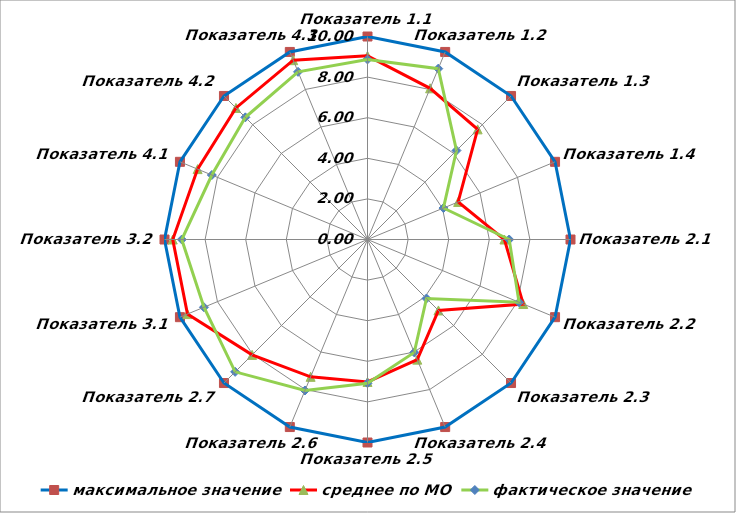
| Category | максимальное значение | среднее по МО | фактическое значение |
|---|---|---|---|
| Показатель 1.1 | 10 | 9.046 | 8.87 |
| Показатель 1.2 | 10 | 8.061 | 9.11 |
| Показатель 1.3 | 10 | 7.673 | 6.2 |
| Показатель 1.4 | 10 | 4.833 | 4.05 |
| Показатель 2.1 | 10 | 6.745 | 6.98 |
| Показатель 2.2 | 10 | 8.305 | 8.08 |
| Показатель 2.3 | 10 | 4.943 | 4.11 |
| Показатель 2.4 | 10 | 6.405 | 6.02 |
| Показатель 2.5 | 10 | 7.017 | 7.08 |
| Показатель 2.6 | 10 | 7.323 | 8.05 |
| Показатель 2.7 | 10 | 8.039 | 9.22 |
| Показатель 3.1 | 10 | 9.599 | 8.72 |
| Показатель 3.2 | 10 | 9.593 | 9.15 |
| Показатель 4.1 | 10 | 9.059 | 8.3 |
| Показатель 4.2 | 10 | 9.164 | 8.51 |
| Показатель 4.3 | 10 | 9.561 | 8.94 |